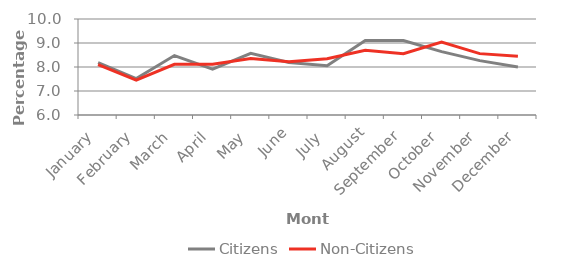
| Category | Citizens | Non-Citizens |
|---|---|---|
| January | 8.181 | 8.102 |
| February | 7.515 | 7.449 |
| March | 8.477 | 8.112 |
| April | 7.91 | 8.118 |
| May | 8.57 | 8.358 |
| June | 8.187 | 8.217 |
| July | 8.049 | 8.348 |
| August | 9.103 | 8.698 |
| September | 9.103 | 8.557 |
| October | 8.642 | 9.038 |
| November | 8.266 | 8.557 |
| December | 7.996 | 8.447 |